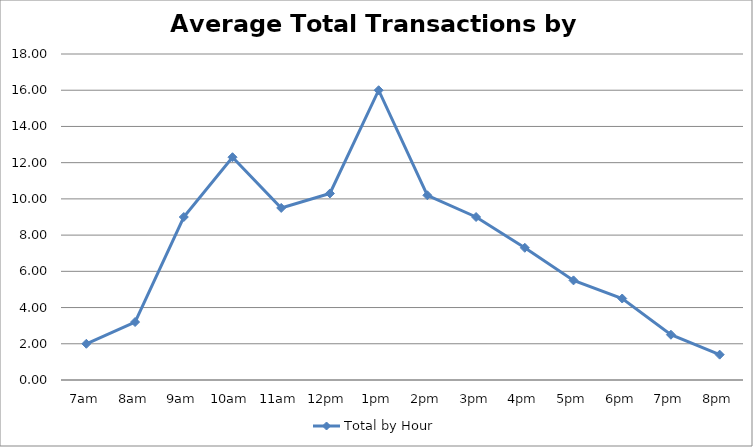
| Category | Total by Hour |
|---|---|
| 7am | 2 |
| 8am | 3.2 |
| 9am | 9 |
| 10am | 12.3 |
| 11am | 9.5 |
| 12pm | 10.3 |
| 1pm | 16 |
| 2pm | 10.2 |
| 3pm | 9 |
| 4pm | 7.3 |
| 5pm | 5.5 |
| 6pm | 4.5 |
| 7pm | 2.5 |
| 8pm | 1.4 |